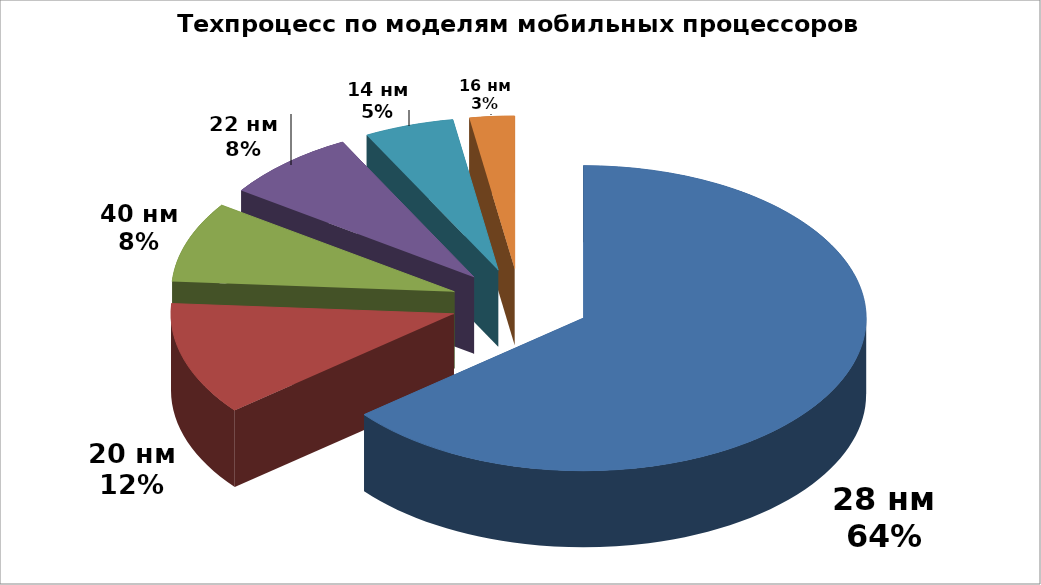
| Category | Series 0 |
|---|---|
| 28 нм | 75 |
| 20 нм | 14 |
| 40 нм | 10 |
| 22 нм | 9 |
| 14 нм | 6 |
| 16 нм | 3 |